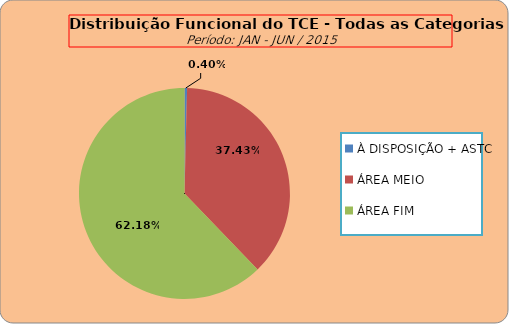
| Category | ÁREAS DE ATUAÇÃO |
|---|---|
| À DISPOSIÇÃO + ASTC | 2 |
| ÁREA MEIO | 189 |
| ÁREA FIM | 314 |